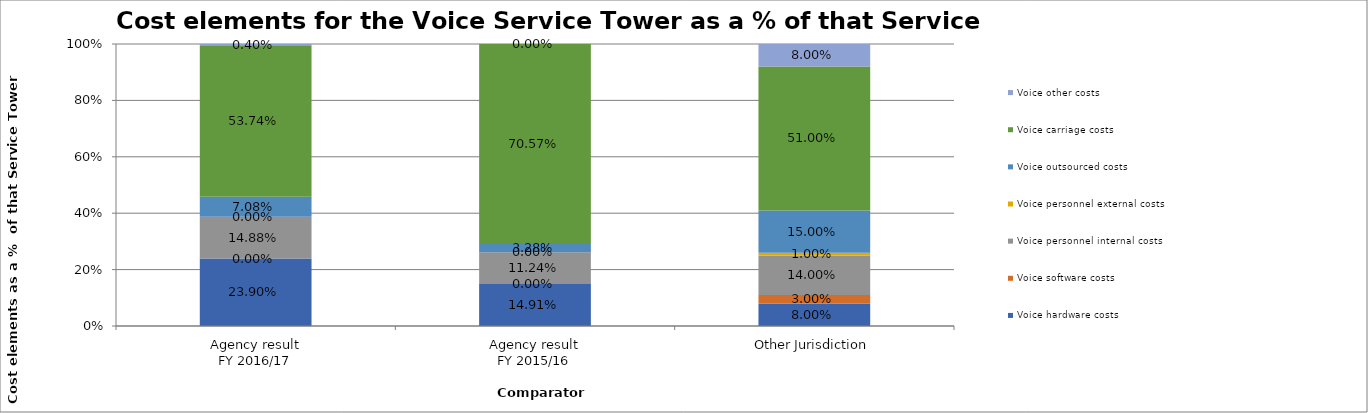
| Category | Voice hardware costs | Voice software costs | Voice personnel internal costs | Voice personnel external costs | Voice outsourced costs | Voice carriage costs | Voice other costs |
|---|---|---|---|---|---|---|---|
| Agency result
FY 2016/17 | 0.239 | 0 | 0.149 | 0 | 0.071 | 0.537 | 0.004 |
| Agency result
FY 2015/16 | 0.149 | 0 | 0.112 | 0 | 0.033 | 0.706 | 0 |
| Other Jurisdiction | 0.08 | 0.03 | 0.14 | 0.01 | 0.15 | 0.51 | 0.08 |